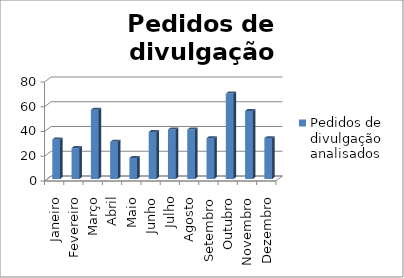
| Category | Pedidos de divulgação analisados  |
|---|---|
| Janeiro | 32 |
| Fevereiro | 25 |
| Março | 56 |
| Abril | 30 |
| Maio | 17 |
| Junho | 38 |
| Julho | 40 |
| Agosto | 40 |
| Setembro | 33 |
| Outubro | 69 |
| Novembro | 55 |
| Dezembro | 33 |